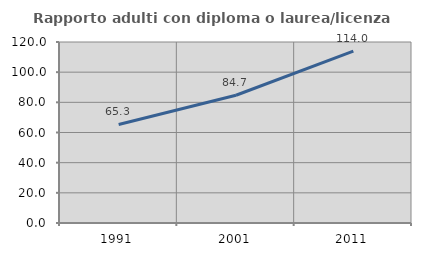
| Category | Rapporto adulti con diploma o laurea/licenza media  |
|---|---|
| 1991.0 | 65.331 |
| 2001.0 | 84.686 |
| 2011.0 | 113.98 |